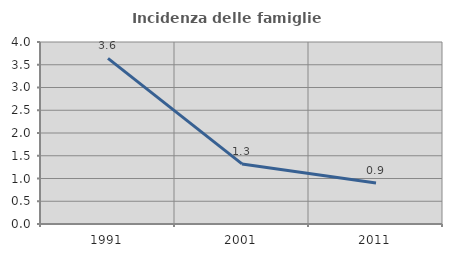
| Category | Incidenza delle famiglie numerose |
|---|---|
| 1991.0 | 3.639 |
| 2001.0 | 1.321 |
| 2011.0 | 0.9 |